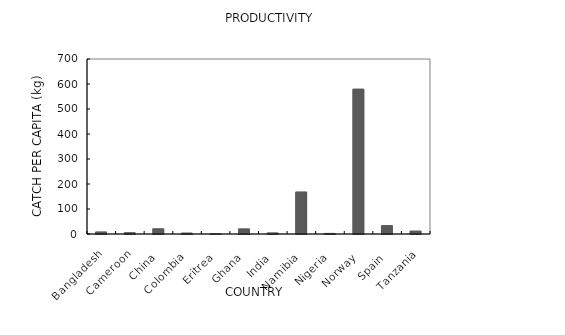
| Category | Catch (kg) pr km2 |
|---|---|
| Bangladesh | 8.377 |
| Cameroon | 5.333 |
| China | 21.049 |
| Colombia | 3.957 |
| Eritrea | 1.063 |
| Ghana | 20.624 |
| India | 4.472 |
| Namibia | 168.224 |
| Nigeria | 2.388 |
| Norway | 579.749 |
| Spain | 33.846 |
| Tanzania | 11.897 |